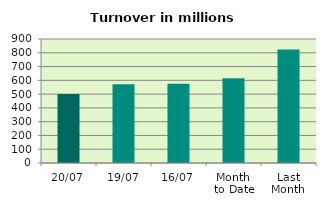
| Category | Series 0 |
|---|---|
| 20/07 | 500.272 |
| 19/07 | 571.616 |
| 16/07 | 574.454 |
| Month 
to Date | 615.745 |
| Last
Month | 824.124 |